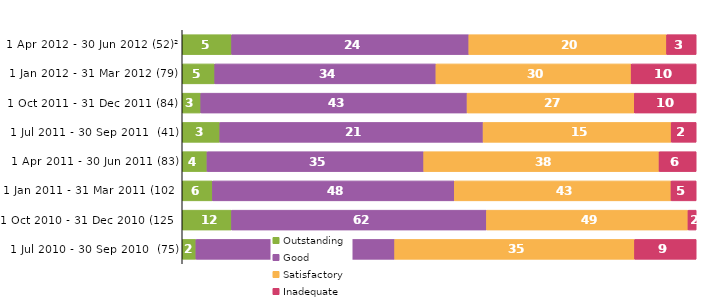
| Category | Outstanding | Good | Satisfactory | Inadequate |
|---|---|---|---|---|
| 1 Apr 2012 - 30 Jun 2012 (52)² | 5 | 24 | 20 | 3 |
| 1 Jan 2012 - 31 Mar 2012 (79) | 5 | 34 | 30 | 10 |
| 1 Oct 2011 - 31 Dec 2011 (84) | 3 | 43 | 27 | 10 |
| 1 Jul 2011 - 30 Sep 2011  (41) | 3 | 21 | 15 | 2 |
| 1 Apr 2011 - 30 Jun 2011 (83) | 4 | 35 | 38 | 6 |
| 1 Jan 2011 - 31 Mar 2011 (102) | 6 | 48 | 43 | 5 |
| 1 Oct 2010 - 31 Dec 2010 (125) | 12 | 62 | 49 | 2 |
| 1 Jul 2010 - 30 Sep 2010  (75) | 2 | 29 | 35 | 9 |